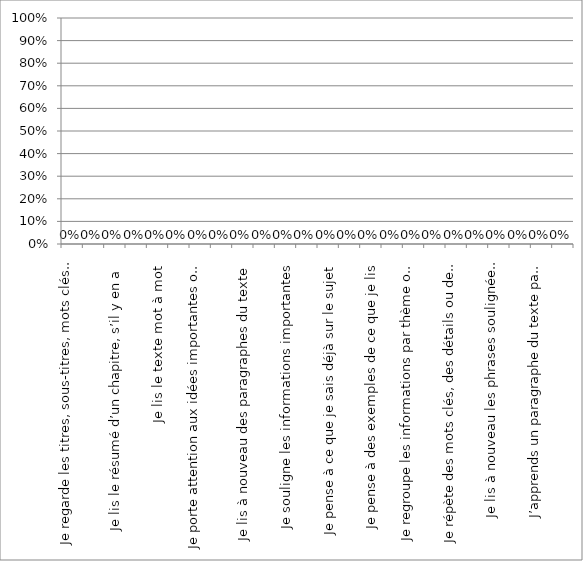
| Category | Series 0 |
|---|---|
| Je regarde les titres, sous-titres, mots clés, images, cartes ou graphiques | 0 |
| Je regarde la table des matières, s’il y en a une | 0 |
| Je lis le résumé d’un chapitre, s’il y en a  | 0 |
| Je survole le texte | 0 |
| Je lis le texte mot à mot  | 0 |
| Je porte attention à ce qui est souligné ou en caractère gras, s’il y en a | 0 |
| Je porte attention aux idées importantes ou aux thèmes  | 0 |
| Je fais une image de ce que je lis dans ma tête | 0 |
| Je lis à nouveau des paragraphes du texte | 0 |
| Je copie des parties du texte | 0 |
| Je souligne les informations importantes | 0 |
| Je prends en note les idées importantes | 0 |
| Je pense à ce que je sais déjà sur le sujet | 0 |
| Je résume ce que je lis dans mes mots | 0 |
| Je pense à des exemples de ce que je lis | 0 |
| Je pense à appliquer ce que je lis pour résoudre un problème ou répondre à des questions | 0 |
| Je regroupe les informations par thème ou sujet | 0 |
| Je trouve les liens entre les informations que je veux retenir | 0 |
| Je répète des mots clés, des détails ou des faits dans ma tête | 0 |
| Je fais un dessin, schéma, toile d’araignée, carte sémantique qui représente les informations | 0 |
| Je lis à nouveau les phrases soulignées dans le texte | 0 |
| Je retiens les mots clés, les détails ou les faits | 0 |
| J’apprends un paragraphe du texte par cœur | 0 |
| Je cherche à trouver le sens de ce que je lis  | 0 |